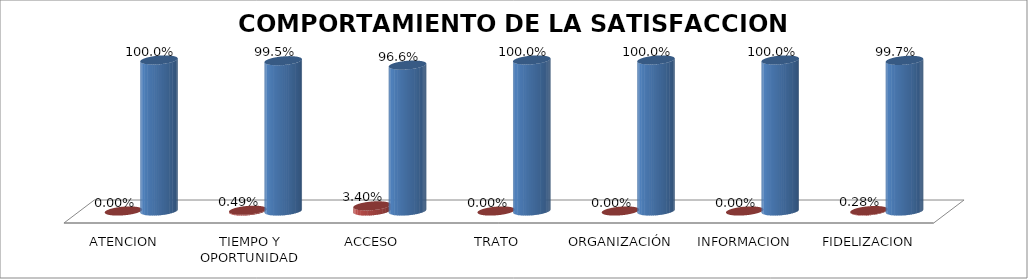
| Category | TOTAL |
|---|---|
| ATENCION | 1 |
| TIEMPO Y OPORTUNIDAD | 0.995 |
| ACCESO | 0.966 |
| TRATO | 1 |
| ORGANIZACIÓN | 1 |
| INFORMACION | 1 |
| FIDELIZACION | 0.997 |